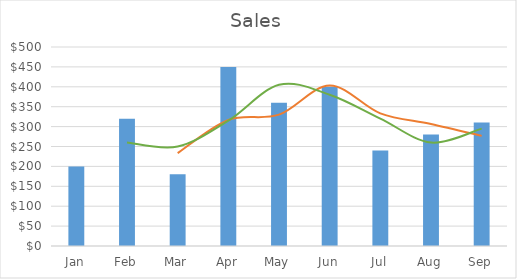
| Category | Sales |
|---|---|
| Jan | 200 |
| Feb | 320 |
| Mar | 180 |
| Apr | 450 |
| May | 360 |
| Jun | 400 |
| Jul | 240 |
| Aug | 280 |
| Sep | 310 |